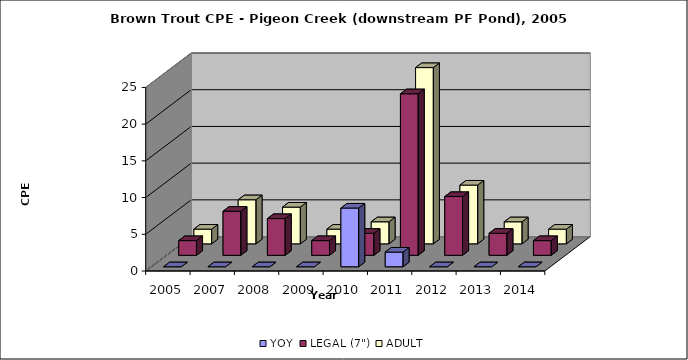
| Category | YOY | LEGAL (7") | ADULT |
|---|---|---|---|
| 2005.0 | 0 | 2 | 2 |
| 2007.0 | 0 | 6 | 6 |
| 2008.0 | 0 | 5 | 5 |
| 2009.0 | 0 | 2 | 2 |
| 2010.0 | 8 | 3 | 3 |
| 2011.0 | 2 | 22 | 24 |
| 2012.0 | 0 | 8 | 8 |
| 2013.0 | 0 | 3 | 3 |
| 2014.0 | 0 | 2 | 2 |